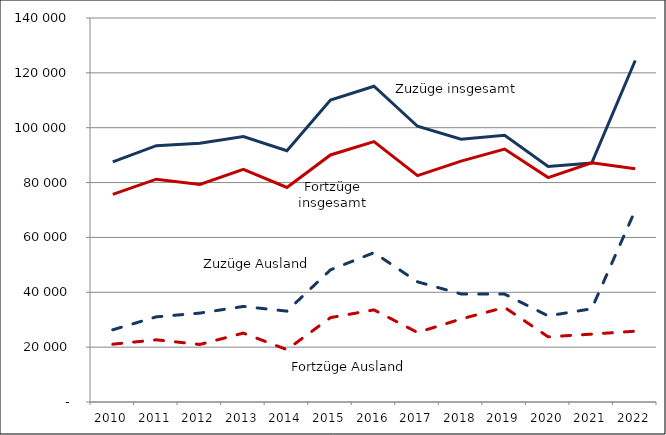
| Category | Zuzüge insgesamt | Zuzüge Ausland | Fortzüge insgesamt | Fortzüge Ausland |
|---|---|---|---|---|
| 2010.0 | 87538 | 26324 | 75668 | 21078 |
| 2011.0 | 93466 | 31048 | 81231 | 22674 |
| 2012.0 | 94346 | 32412 | 79335 | 20979 |
| 2013.0 | 96782 | 34839 | 84823 | 25125 |
| 2014.0 | 91594 | 33131 | 78218 | 19091 |
| 2015.0 | 110070 | 48173 | 90072 | 30757 |
| 2016.0 | 115115 | 54438 | 94914 | 33587 |
| 2017.0 | 100534 | 43809 | 82525 | 25341 |
| 2018.0 | 95790 | 39392 | 87811 | 30263 |
| 2019.0 | 97239 | 39348 | 92236 | 34484 |
| 2020.0 | 85885 | 31407 | 81828 | 23767 |
| 2021.0 | 87108 | 33996 | 87178 | 24741 |
| 2022.0 | 124493 | 69908 | 85065 | 25817 |